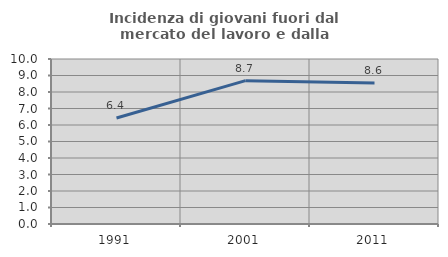
| Category | Incidenza di giovani fuori dal mercato del lavoro e dalla formazione  |
|---|---|
| 1991.0 | 6.421 |
| 2001.0 | 8.686 |
| 2011.0 | 8.551 |